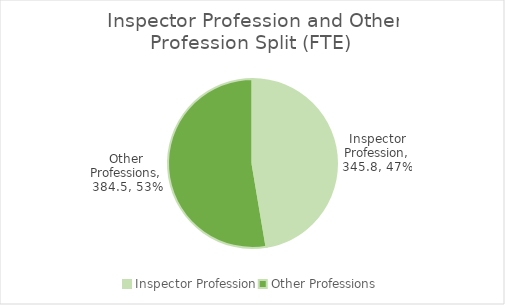
| Category | FTE |
|---|---|
| Inspector Profession | 345.785 |
| Other Professions | 384.537 |